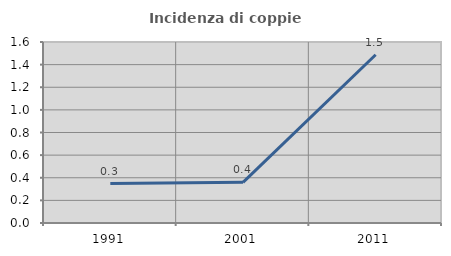
| Category | Incidenza di coppie miste |
|---|---|
| 1991.0 | 0.348 |
| 2001.0 | 0.36 |
| 2011.0 | 1.487 |